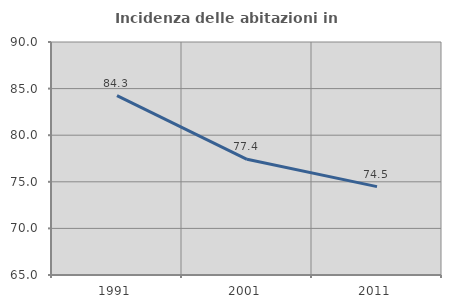
| Category | Incidenza delle abitazioni in proprietà  |
|---|---|
| 1991.0 | 84.253 |
| 2001.0 | 77.413 |
| 2011.0 | 74.483 |